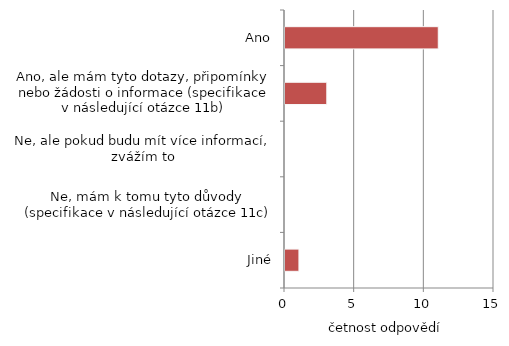
| Category | Series 0 |
|---|---|
| Jiné | 1 |
| Ne, mám k tomu tyto důvody (specifikace v následující otázce 11c) | 0 |
| Ne, ale pokud budu mít více informací, zvážím to | 0 |
| Ano, ale mám tyto dotazy, připomínky nebo žádosti o informace (specifikace v následující otázce 11b) | 3 |
| Ano | 11 |